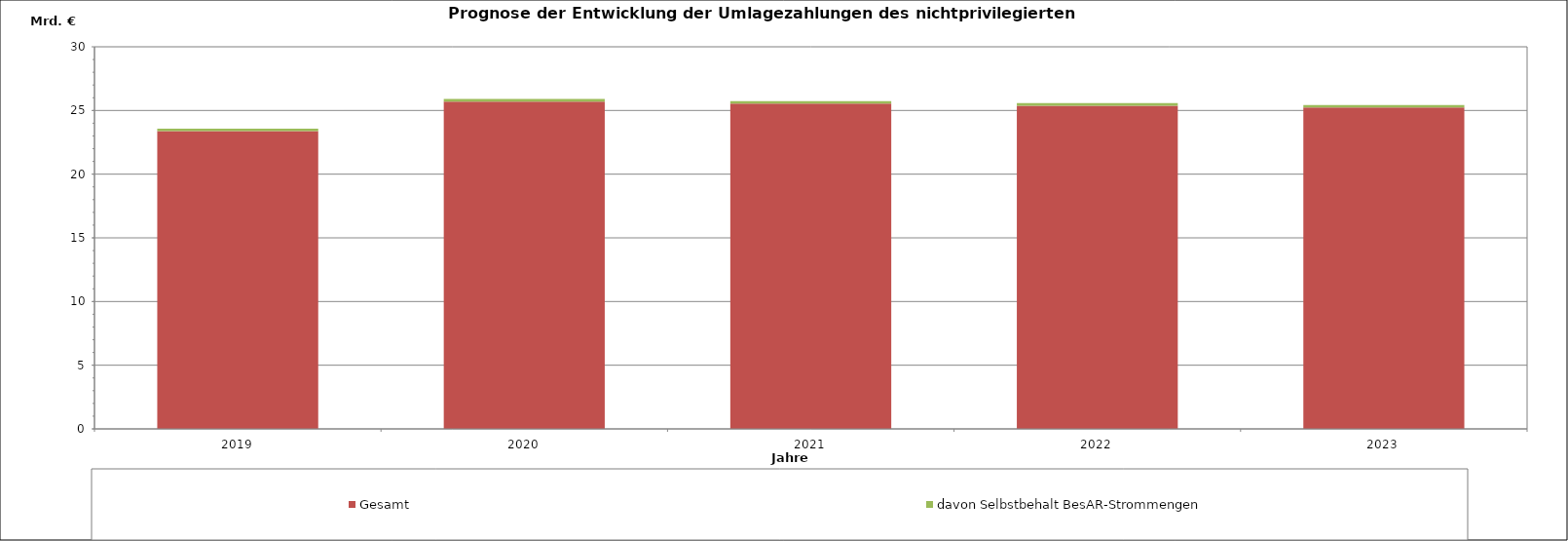
| Category |  Gesamt  |  davon Selbstbehalt BesAR-Strommengen  |
|---|---|---|
| 2019.0 | 23388.509 | 179.92 |
| 2020.0 | 25704.119 | 198.675 |
| 2021.0 | 25541.052 | 198.675 |
| 2022.0 | 25374.323 | 198.675 |
| 2023.0 | 25232.815 | 198.675 |